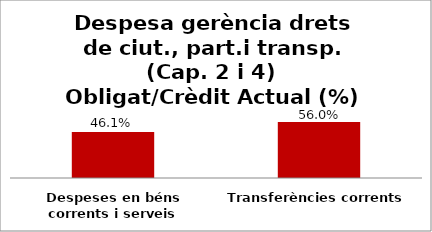
| Category | Series 0 |
|---|---|
| Despeses en béns corrents i serveis | 0.461 |
| Transferències corrents | 0.56 |